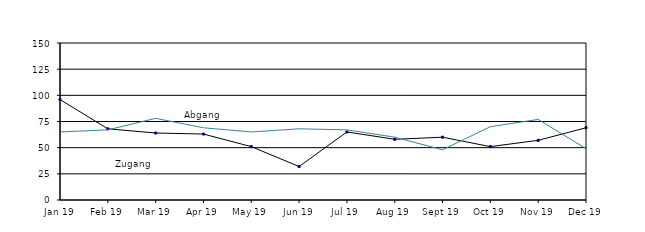
| Category | Zugang | Abgang |
|---|---|---|
| 2019-01-01 | 96 | 65 |
| 2019-02-01 | 68 | 67 |
| 2019-03-01 | 64 | 78 |
| 2019-04-01 | 63 | 69 |
| 2019-05-01 | 51 | 65 |
| 2019-06-01 | 32 | 68 |
| 2019-07-01 | 65 | 67 |
| 2019-08-01 | 58 | 60 |
| 2019-09-01 | 60 | 48 |
| 2019-10-01 | 51 | 70 |
| 2019-11-01 | 57 | 77 |
| 2019-12-01 | 69 | 49 |